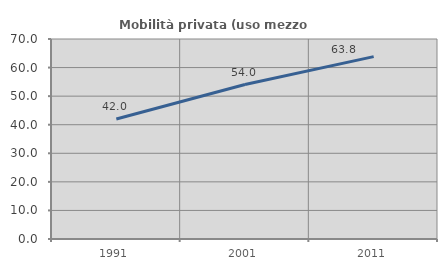
| Category | Mobilità privata (uso mezzo privato) |
|---|---|
| 1991.0 | 41.979 |
| 2001.0 | 54.05 |
| 2011.0 | 63.826 |